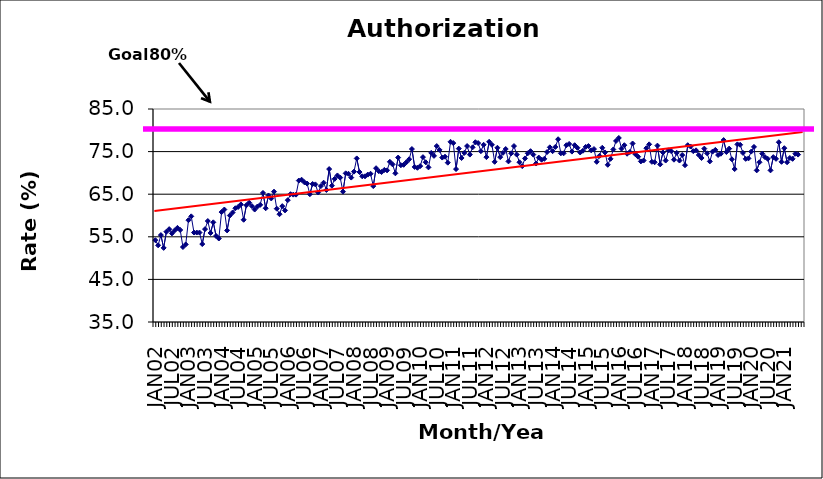
| Category | Series 0 |
|---|---|
| JAN02 | 54.2 |
| FEB02 | 53 |
| MAR02 | 55.4 |
| APR02 | 52.4 |
| MAY02 | 56.2 |
| JUN02 | 56.8 |
| JUL02 | 55.8 |
| AUG02 | 56.5 |
| SEP02 | 57.1 |
| OCT02 | 56.6 |
| NOV02 | 52.6 |
| DEC02 | 53.2 |
| JAN03 | 58.9 |
| FEB03 | 59.8 |
| MAR03 | 56 |
| APR03 | 56 |
| MAY03 | 56 |
| JUN03 | 53.3 |
| JUL03 | 56.8 |
| AUG03 | 58.7 |
| SEP03 | 55.9 |
| OCT03 | 58.4 |
| NOV03 | 55.2 |
| DEC03 | 54.6 |
| JAN04 | 60.8 |
| FEB04 | 61.4 |
| MAR04 | 56.5 |
| APR04 | 60 |
| MAY04 | 60.7 |
| JUN04 | 61.7 |
| JUL04 | 62 |
| AUG04 | 62.6 |
| SEP04 | 59 |
| OCT04 | 62.4 |
| NOV04 | 63 |
| DEC04 | 62.2 |
| JAN05 | 61.4 |
| FEB05 | 62.1 |
| MAR05 | 62.5 |
| APR05 | 65.3 |
| MAY05 | 61.7 |
| JUN05 | 64.7 |
| JUL05 | 64 |
| AUG05 | 65.6 |
| SEP05 | 61.6 |
| OCT05 | 60.3 |
| NOV05 | 62.2 |
| DEC05 | 61.2 |
| JAN06 | 63.6 |
| FEB06 | 65 |
| MAR06 | 64.9 |
| APR06 | 64.9 |
| MAY06 | 68.2 |
| JUN06 | 68.4 |
| JUL06 | 67.8 |
| AUG06 | 67.5 |
| SEP06 | 65 |
| OCT06 | 67.4 |
| NOV06 | 67.3 |
| DEC06 | 65.4 |
| JAN07 | 66.9 |
| FEB07 | 67.7 |
| MAR07 | 66 |
| APR07 | 70.9 |
| MAY07 | 67 |
| JUN07 | 68.6 |
| JUL07 | 69.4 |
| AUG07 | 68.9 |
| SEP07 | 65.6 |
| OCT07 | 69.9 |
| NOV07 | 69.8 |
| DEC07 | 68.9 |
| JAN08 | 70.3 |
| FEB08 | 73.4 |
| MAR08 | 70.2 |
| APR08 | 69.2 |
| MAY08 | 69.2 |
| JUN08 | 69.6 |
| JUL08 | 69.8 |
| AUG08 | 66.9 |
| SEP08 | 71.1 |
| OCT08 | 70.4 |
| NOV08 | 70.2 |
| DEC08 | 70.7 |
| JAN09 | 70.6 |
| FEB09 | 72.6 |
| MAR09 | 72 |
| APR09 | 69.9 |
| MAY09 | 73.6 |
| JUN09 | 71.8 |
| JUL09 | 71.9 |
| AUG09 | 72.5 |
| SEP09 | 73.2 |
| OCT09 | 75.6 |
| NOV09 | 71.4 |
| DEC09 | 71.2 |
| JAN10 | 71.6 |
| FEB10 | 73.7 |
| MAR10 | 72.5 |
| APR10 | 71.3 |
| MAY10 | 74.7 |
| JUN10 | 74 |
| JUL10 | 76.3 |
| AUG10 | 75.4 |
| SEP10 | 73.6 |
| OCT10 | 73.8 |
| NOV10 | 72.4 |
| DEC10 | 77.3 |
| JAN11 | 77 |
| FEB11 | 70.9 |
| MAR11 | 75.7 |
| APR11 | 73.5 |
| MAY11 | 74.7 |
| JUN11 | 76.3 |
| JUL11 | 74.3 |
| AUG11 | 76 |
| SEP11 | 77.2 |
| OCT11 | 77 |
| NOV11 | 75.1 |
| DEC11 | 76.6 |
| JAN12 | 73.7 |
| FEB12 | 77.3 |
| MAR12 | 76.6 |
| APR12 | 72.6 |
| MAY12 | 75.9 |
| JUN12 | 73.7 |
| JUL12 | 74.7 |
| AUG12 | 75.6 |
| SEP12 | 72.7 |
| OCT12 | 74.6 |
| NOV12 | 76.3 |
| DEC12 | 74.3 |
| JAN13 | 72.5 |
| FEB13 | 71.6 |
| MAR13 | 73.4 |
| APR13 | 74.6 |
| MAY13 | 75.1 |
| JUN13 | 74.3 |
| JUL13 | 72.2 |
| AUG13 | 73.6 |
| SEP13 | 73.1 |
| OCT13 | 73.3 |
| NOV13 | 74.9 |
| DEC13 | 76 |
| JAN14 | 75.1 |
| FEB14 | 76.1 |
| MAR14 | 77.9 |
| APR14 | 74.6 |
| MAY14 | 74.6 |
| JUN14 | 76.5 |
| JUL14 | 76.8 |
| AUG14 | 75 |
| SEP14 | 76.5 |
| OCT14 | 75.9 |
| NOV14 | 74.8 |
| DEC14 | 75.2 |
| JAN15 | 76.1 |
| FEB15 | 76.3 |
| MAR15 | 75.3 |
| APR15 | 75.6 |
| MAY15 | 72.6 |
| JUN15 | 74 |
| JUL15 | 75.9 |
| AUG15 | 74.8 |
| SEP15 | 71.9 |
| OCT15 | 73.3 |
| NOV15 | 75.5 |
| DEC15 | 77.5 |
| JAN16 | 78.2 |
| FEB16 | 75.7 |
| MAR16 | 76.5 |
| APR16 | 74.5 |
| MAY16 | 74.9 |
| JUN16 | 76.9 |
| JUL16 | 74.4 |
| AUG16 | 73.8 |
| SEP16 | 72.7 |
| OCT16 | 72.9 |
| NOV16 | 75.8 |
| DEC16 | 76.7 |
| JAN17 | 72.6 |
| FEB17 | 72.5 |
| MAR17 | 76.4 |
| APR17 | 72 |
| MAY17 | 74.8 |
| JUN17 | 72.9 |
| JUL17 | 75.3 |
| AUG17 | 75.1 |
| SEP17 | 73.1 |
| OCT17 | 74.7 |
| NOV17 | 72.9 |
| DEC17 | 74.2 |
| JAN18 | 71.8 |
| FEB18 | 76.5 |
| MAR18 | 76.2 |
| APR18 | 75.1 |
| MAY18 | 75.3 |
| JUN18 | 74.2 |
| JUL18 | 73.5 |
| AUG18 | 75.7 |
| SEP18 | 74.6 |
| OCT18 | 72.7 |
| NOV18 | 75 |
| DEC18 | 75.4 |
| JAN19 | 74.2 |
| FEB19 | 74.5 |
| MAR19 | 77.7 |
| APR19 | 74.9 |
| MAY19 | 75.7 |
| JUN19 | 73.2 |
| JUL19 | 70.9 |
| AUG19 | 76.7 |
| SEP19 | 76.6 |
| OCT19 | 74.7 |
| NOV19 | 73.3 |
| DEC19 | 73.4 |
| JAN20 | 75 |
| FEB20 | 76.1 |
| MAR20 | 70.6 |
| APR20 | 72.5 |
| MAY20 | 74.5 |
| JUN20 | 73.7 |
| JUL20 | 73.3 |
| AUG20 | 70.6 |
| SEP20 | 73.7 |
| OCT20 | 73.3 |
| NOV20 | 77.2 |
| DEC20 | 72.6 |
| JAN21 | 75.8 |
| FEB21 | 72.5 |
| MAR21 | 73.5 |
| APR21 | 73.3 |
| MAY21 | 74.5 |
| JUN21 | 74.3 |